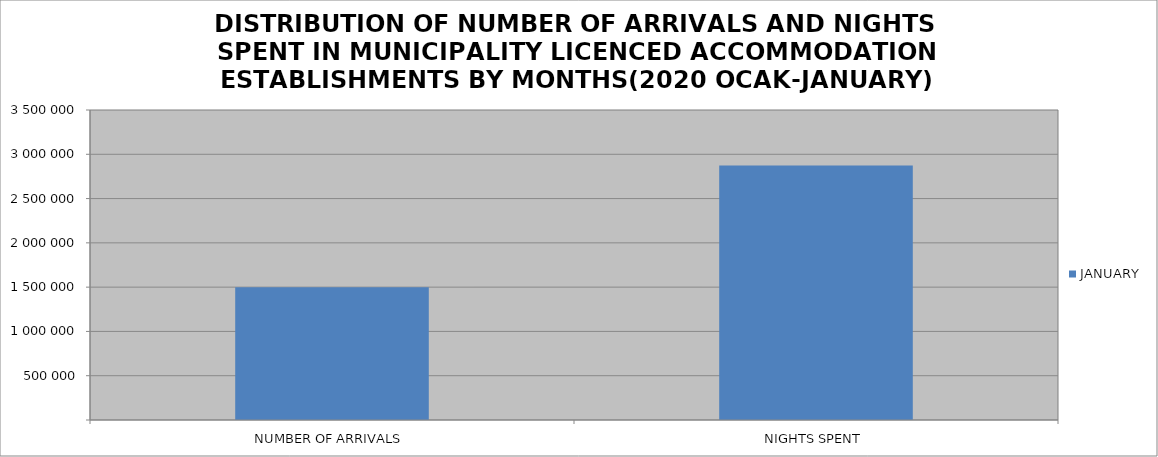
| Category | JANUARY |
|---|---|
| NUMBER OF ARRIVALS | 1497815 |
| NIGHTS SPENT | 2872303 |